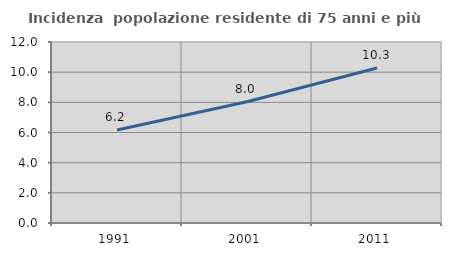
| Category | Incidenza  popolazione residente di 75 anni e più |
|---|---|
| 1991.0 | 6.166 |
| 2001.0 | 8.043 |
| 2011.0 | 10.281 |